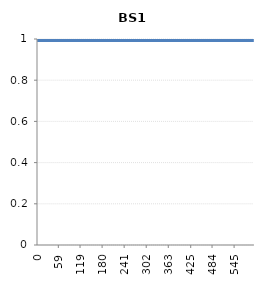
| Category | BS1 |
|---|---|
| 0.0 | 1 |
| 573.0 | 1 |
| 573.0 | 1 |
| 599.0 | 1 |
| 599.0 | 1 |